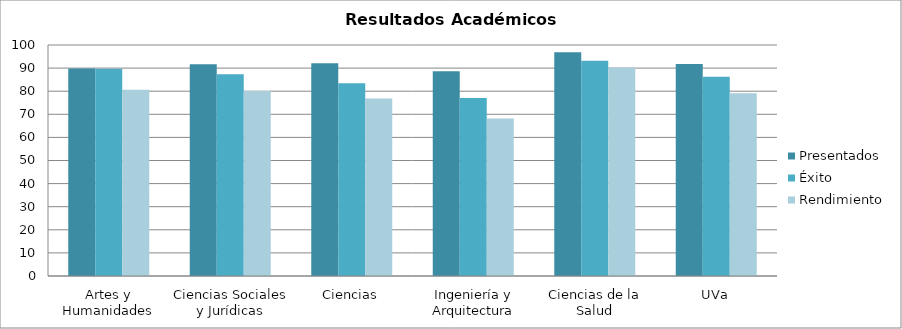
| Category | Presentados | Éxito | Rendimiento |
|---|---|---|---|
| Artes y Humanidades | 89.847 | 89.748 | 80.636 |
| Ciencias Sociales y Jurídicas | 91.679 | 87.3 | 80.036 |
| Ciencias | 92.106 | 83.428 | 76.842 |
| Ingeniería y Arquitectura | 88.588 | 77.021 | 68.231 |
| Ciencias de la Salud | 96.907 | 93.17 | 90.288 |
| UVa | 91.765 | 86.23 | 79.129 |